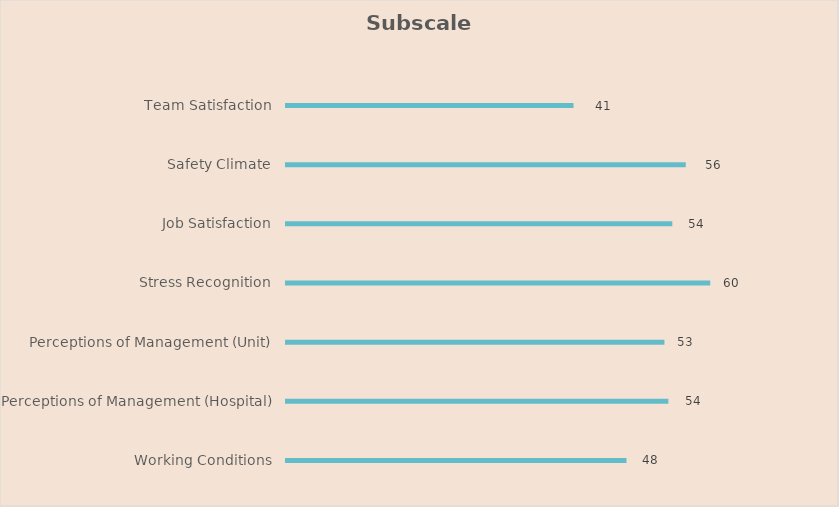
| Category | Total |
|---|---|
| Team Satisfaction | 40.556 |
| Safety Climate | 56.333 |
| Job Satisfaction | 54.444 |
| Stress Recognition | 59.778 |
| Perceptions of Management (Unit) | 53.333 |
| Perceptions of Management (Hospital) | 53.889 |
| Working Conditions | 48 |